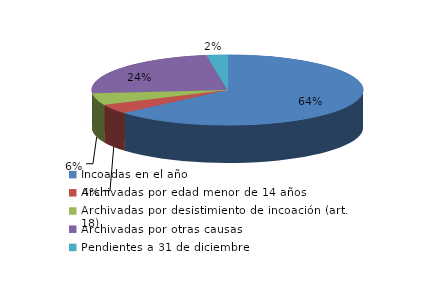
| Category | Series 0 |
|---|---|
| Incoadas en el año | 817 |
| Archivadas por edad menor de 14 años | 56 |
| Archivadas por desistimiento de incoación (art. 18) | 71 |
| Archivadas por otras causas | 307 |
| Pendientes a 31 de diciembre | 32 |